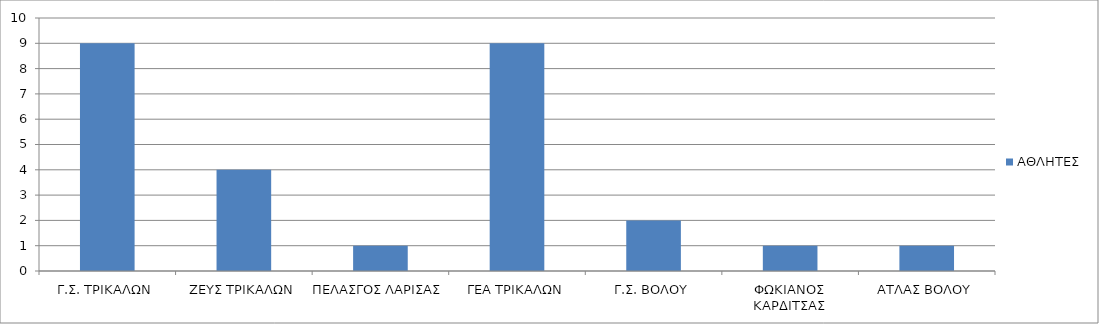
| Category | ΑΘΛΗΤΕΣ |
|---|---|
| Γ.Σ. ΤΡΙΚΑΛΩΝ | 9 |
| ΖΕΥΣ ΤΡΙΚΑΛΩΝ | 4 |
| ΠΕΛΑΣΓΟΣ ΛΑΡΙΣΑΣ | 1 |
| ΓΕΑ ΤΡΙΚΑΛΩΝ | 9 |
| Γ.Σ. ΒΟΛΟΥ | 2 |
| ΦΩΚΙΑΝΟΣ ΚΑΡΔΙΤΣΑΣ | 1 |
| ΑΤΛΑΣ ΒΟΛΟΥ | 1 |